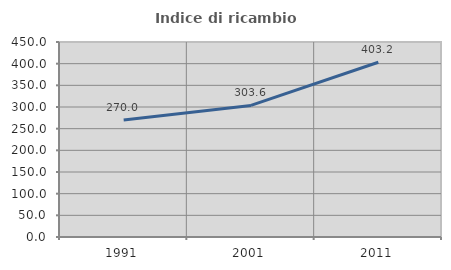
| Category | Indice di ricambio occupazionale  |
|---|---|
| 1991.0 | 270 |
| 2001.0 | 303.65 |
| 2011.0 | 403.175 |